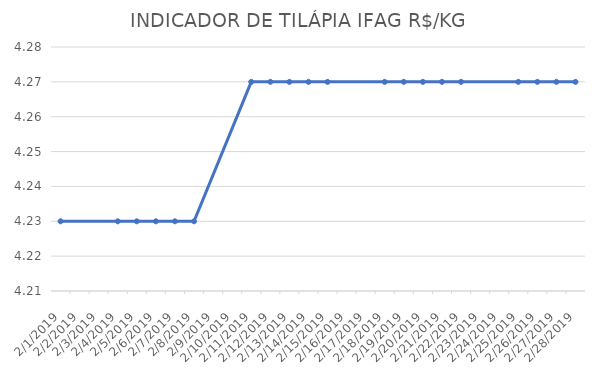
| Category | INDICADOR DE TILÁPIA IFAG |
|---|---|
| 2/1/19 | 4.23 |
| 2/4/19 | 4.23 |
| 2/5/19 | 4.23 |
| 2/6/19 | 4.23 |
| 2/7/19 | 4.23 |
| 2/8/19 | 4.23 |
| 2/11/19 | 4.27 |
| 2/12/19 | 4.27 |
| 2/13/19 | 4.27 |
| 2/14/19 | 4.27 |
| 2/15/19 | 4.27 |
| 2/18/19 | 4.27 |
| 2/19/19 | 4.27 |
| 2/20/19 | 4.27 |
| 2/21/19 | 4.27 |
| 2/22/19 | 4.27 |
| 2/25/19 | 4.27 |
| 2/26/19 | 4.27 |
| 2/27/19 | 4.27 |
| 2/28/19 | 4.27 |